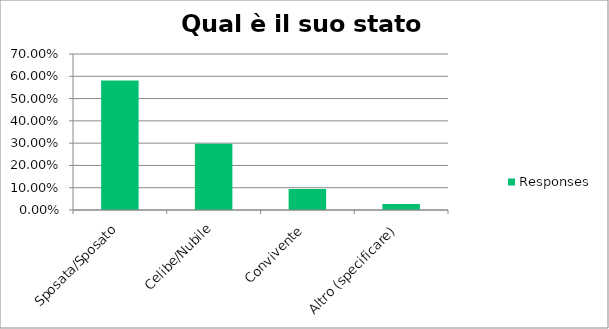
| Category | Responses |
|---|---|
| Sposata/Sposato | 0.581 |
| Celibe/Nubile | 0.297 |
| Convivente | 0.095 |
| Altro (specificare) | 0.027 |